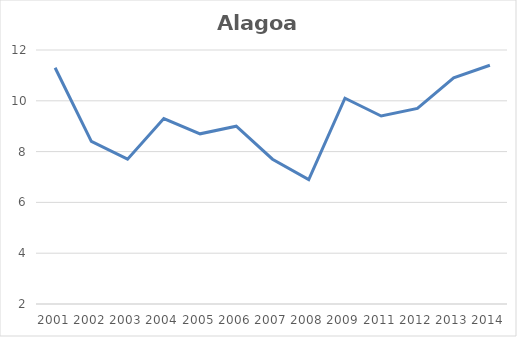
| Category | Total |
|---|---|
| 2001.0 | 11.3 |
| 2002.0 | 8.4 |
| 2003.0 | 7.7 |
| 2004.0 | 9.3 |
| 2005.0 | 8.7 |
| 2006.0 | 9 |
| 2007.0 | 7.7 |
| 2008.0 | 6.9 |
| 2009.0 | 10.1 |
| 2011.0 | 9.4 |
| 2012.0 | 9.7 |
| 2013.0 | 10.9 |
| 2014.0 | 11.4 |